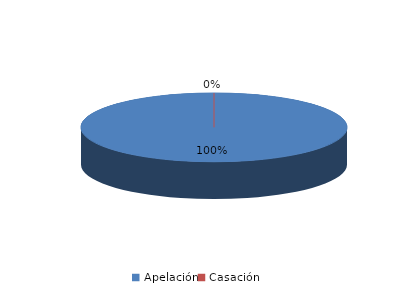
| Category | Series 0 |
|---|---|
| Apelación | 8 |
| Casación | 0 |